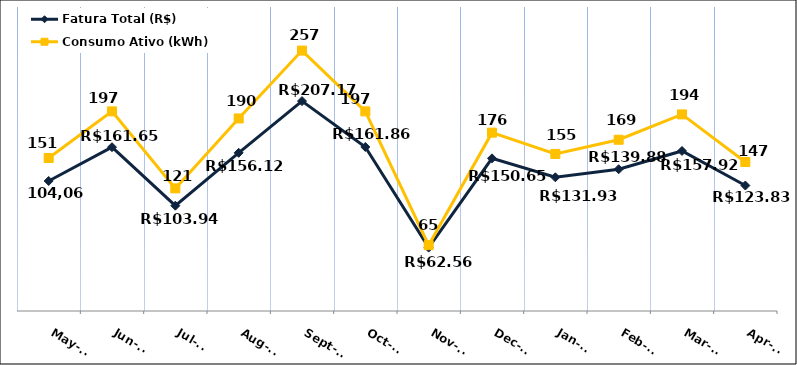
| Category | Fatura Total (R$) | Consumo Ativo (kWh) |
|---|---|---|
| 2023-05-01 | 128.31 | 151 |
| 2023-06-01 | 161.65 | 197 |
| 2023-07-01 | 103.94 | 121 |
| 2023-08-01 | 156.12 | 190 |
| 2023-09-01 | 207.17 | 257 |
| 2023-10-01 | 161.86 | 197 |
| 2023-11-01 | 62.56 | 65 |
| 2023-12-01 | 150.65 | 176 |
| 2024-01-01 | 131.93 | 155 |
| 2024-02-01 | 139.88 | 169 |
| 2024-03-01 | 157.92 | 194 |
| 2024-04-01 | 123.83 | 147 |